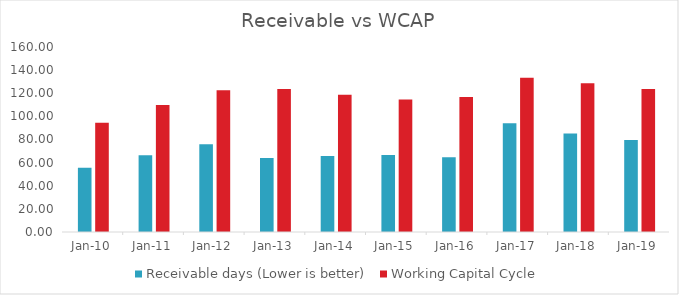
| Category | Receivable days (Lower is better) | Working Capital Cycle |
|---|---|---|
| 2010-03-31 | 55.602 | 94.48 |
| 2011-03-31 | 66.43 | 109.86 |
| 2012-03-31 | 75.909 | 122.611 |
| 2013-03-31 | 64.079 | 123.609 |
| 2014-03-31 | 65.72 | 118.608 |
| 2015-03-31 | 66.508 | 114.636 |
| 2016-03-31 | 64.71 | 116.787 |
| 2017-03-31 | 93.984 | 133.489 |
| 2018-03-31 | 85.191 | 128.666 |
| 2019-03-31 | 79.668 | 123.768 |